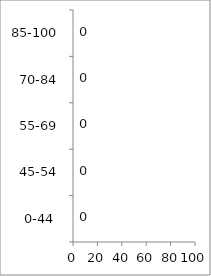
| Category | Series 0 | Series 1 |
|---|---|---|
| 0-44  |  | 0 |
| 45-54 |  | 0 |
| 55-69 |  | 0 |
| 70-84 |  | 0 |
| 85-100 |  | 0 |